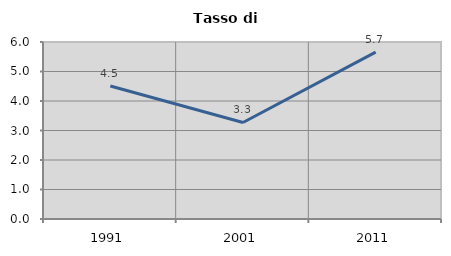
| Category | Tasso di disoccupazione   |
|---|---|
| 1991.0 | 4.508 |
| 2001.0 | 3.272 |
| 2011.0 | 5.657 |